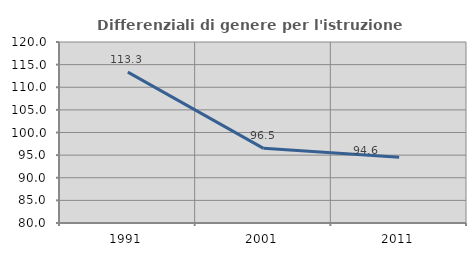
| Category | Differenziali di genere per l'istruzione superiore |
|---|---|
| 1991.0 | 113.34 |
| 2001.0 | 96.496 |
| 2011.0 | 94.556 |